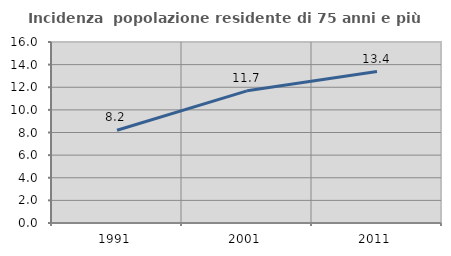
| Category | Incidenza  popolazione residente di 75 anni e più |
|---|---|
| 1991.0 | 8.198 |
| 2001.0 | 11.681 |
| 2011.0 | 13.39 |